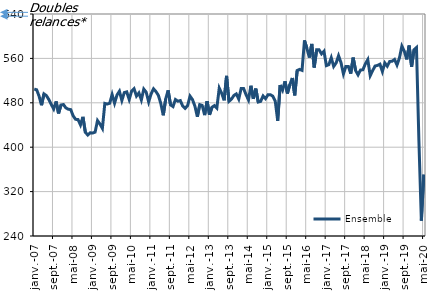
| Category | Ensemble |
|---|---|
| 2007-01-01 | 504.7 |
| 2007-02-01 | 503.5 |
| 2007-03-01 | 491.9 |
| 2007-04-01 | 475.6 |
| 2007-05-01 | 496.1 |
| 2007-06-01 | 493 |
| 2007-07-01 | 485.9 |
| 2007-08-01 | 477.1 |
| 2007-09-01 | 468.8 |
| 2007-10-01 | 482.5 |
| 2007-11-01 | 460.9 |
| 2007-12-01 | 476 |
| 2008-01-01 | 476.9 |
| 2008-02-01 | 470.8 |
| 2008-03-01 | 468.5 |
| 2008-04-01 | 467.7 |
| 2008-05-01 | 456.4 |
| 2008-06-01 | 450.2 |
| 2008-07-01 | 449.8 |
| 2008-08-01 | 440.2 |
| 2008-09-01 | 454.7 |
| 2008-10-01 | 426.9 |
| 2008-11-01 | 421.9 |
| 2008-12-01 | 426 |
| 2009-01-01 | 425.5 |
| 2009-02-01 | 427.2 |
| 2009-03-01 | 448 |
| 2009-04-01 | 441.8 |
| 2009-05-01 | 433.9 |
| 2009-06-01 | 478.9 |
| 2009-07-01 | 477.7 |
| 2009-08-01 | 479.2 |
| 2009-09-01 | 494.9 |
| 2009-10-01 | 479.2 |
| 2009-11-01 | 494 |
| 2009-12-01 | 500.9 |
| 2010-01-01 | 484.2 |
| 2010-02-01 | 498.4 |
| 2010-03-01 | 499.7 |
| 2010-04-01 | 486 |
| 2010-05-01 | 501 |
| 2010-06-01 | 505.3 |
| 2010-07-01 | 492.1 |
| 2010-08-01 | 497.8 |
| 2010-09-01 | 485.2 |
| 2010-10-01 | 504.7 |
| 2010-11-01 | 499.1 |
| 2010-12-01 | 481.6 |
| 2011-01-01 | 495.9 |
| 2011-02-01 | 505.2 |
| 2011-03-01 | 500.2 |
| 2011-04-01 | 493.4 |
| 2011-05-01 | 478.6 |
| 2011-06-01 | 457.5 |
| 2011-07-01 | 486.9 |
| 2011-08-01 | 502.5 |
| 2011-09-01 | 476.2 |
| 2011-10-01 | 473.2 |
| 2011-11-01 | 485.9 |
| 2011-12-01 | 482.9 |
| 2012-01-01 | 484 |
| 2012-02-01 | 474.1 |
| 2012-03-01 | 470 |
| 2012-04-01 | 475 |
| 2012-05-01 | 492 |
| 2012-06-01 | 485.8 |
| 2012-07-01 | 473.9 |
| 2012-08-01 | 454.9 |
| 2012-09-01 | 476.7 |
| 2012-10-01 | 475.2 |
| 2012-11-01 | 457.8 |
| 2012-12-01 | 483 |
| 2013-01-01 | 458.3 |
| 2013-02-01 | 471.9 |
| 2013-03-01 | 474.9 |
| 2013-04-01 | 470.6 |
| 2013-05-01 | 506.5 |
| 2013-06-01 | 497 |
| 2013-07-01 | 484.5 |
| 2013-08-01 | 528.5 |
| 2013-09-01 | 482.7 |
| 2013-10-01 | 486.5 |
| 2013-11-01 | 493.2 |
| 2013-12-01 | 496 |
| 2014-01-01 | 486.7 |
| 2014-02-01 | 505.8 |
| 2014-03-01 | 505.7 |
| 2014-04-01 | 494.7 |
| 2014-05-01 | 485.2 |
| 2014-06-01 | 510.7 |
| 2014-07-01 | 487.1 |
| 2014-08-01 | 505.6 |
| 2014-09-01 | 481.4 |
| 2014-10-01 | 482.6 |
| 2014-11-01 | 492.3 |
| 2014-12-01 | 487.5 |
| 2015-01-01 | 494.4 |
| 2015-02-01 | 494.6 |
| 2015-03-01 | 491.9 |
| 2015-04-01 | 482.8 |
| 2015-05-01 | 447.6 |
| 2015-06-01 | 511.9 |
| 2015-07-01 | 502.8 |
| 2015-08-01 | 518.7 |
| 2015-09-01 | 496.8 |
| 2015-10-01 | 512.9 |
| 2015-11-01 | 524.7 |
| 2015-12-01 | 493.4 |
| 2016-01-01 | 538 |
| 2016-02-01 | 540.1 |
| 2016-03-01 | 538.3 |
| 2016-04-01 | 592.4 |
| 2016-05-01 | 578 |
| 2016-06-01 | 561.5 |
| 2016-07-01 | 586.1 |
| 2016-08-01 | 543.6 |
| 2016-09-01 | 575.5 |
| 2016-10-01 | 575.4 |
| 2016-11-01 | 568.2 |
| 2016-12-01 | 572.9 |
| 2017-01-01 | 547 |
| 2017-02-01 | 548.7 |
| 2017-03-01 | 561.2 |
| 2017-04-01 | 545.5 |
| 2017-05-01 | 551.9 |
| 2017-06-01 | 564.8 |
| 2017-07-01 | 552.3 |
| 2017-08-01 | 532.1 |
| 2017-09-01 | 545.6 |
| 2017-10-01 | 545.6 |
| 2017-11-01 | 532.6 |
| 2017-12-01 | 561.4 |
| 2018-01-01 | 538.1 |
| 2018-02-01 | 530.4 |
| 2018-03-01 | 539 |
| 2018-04-01 | 539.6 |
| 2018-05-01 | 550.2 |
| 2018-06-01 | 557.8 |
| 2018-07-01 | 528.9 |
| 2018-08-01 | 538 |
| 2018-09-01 | 546.3 |
| 2018-10-01 | 547.4 |
| 2018-11-01 | 549.5 |
| 2018-12-01 | 536.4 |
| 2019-01-01 | 551.8 |
| 2019-02-01 | 546 |
| 2019-03-01 | 554.5 |
| 2019-04-01 | 554.9 |
| 2019-05-01 | 558.1 |
| 2019-06-01 | 548.1 |
| 2019-07-01 | 560.8 |
| 2019-08-01 | 582.1 |
| 2019-09-01 | 573 |
| 2019-10-01 | 558.2 |
| 2019-11-01 | 583.2 |
| 2019-12-01 | 544.9 |
| 2020-01-01 | 575.6 |
| 2020-02-01 | 579.6 |
| 2020-03-01 | 411.4 |
| 2020-04-01 | 267.7 |
| 2020-05-01 | 350.5 |